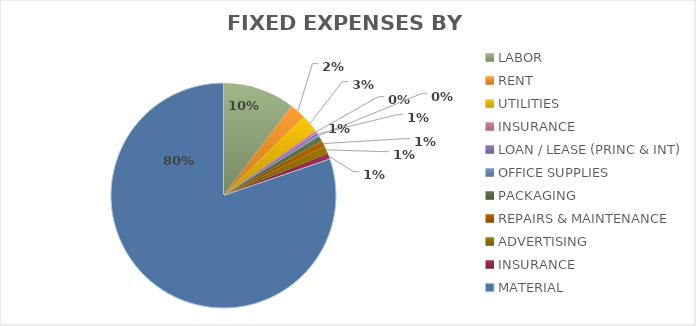
| Category | Series 0 |
|---|---|
| LABOR | 255600 |
| RENT | 56800 |
| UTILITIES | 63900 |
| INSURANCE | 8520 |
| LOAN / LEASE (PRINC & INT) | 10000 |
| OFFICE SUPPLIES | 3976 |
| PACKAGING | 19880 |
| REPAIRS & MAINTENANCE | 19880 |
| ADVERTISING | 28400 |
| INSURANCE | 19880 |
| MATERIAL | 1980977.21 |